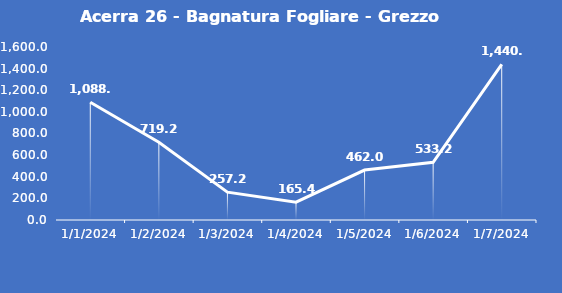
| Category | Acerra 26 - Bagnatura Fogliare - Grezzo (min) |
|---|---|
| 1/1/24 | 1088.4 |
| 1/2/24 | 719.2 |
| 1/3/24 | 257.2 |
| 1/4/24 | 165.4 |
| 1/5/24 | 462 |
| 1/6/24 | 533.2 |
| 1/7/24 | 1440 |